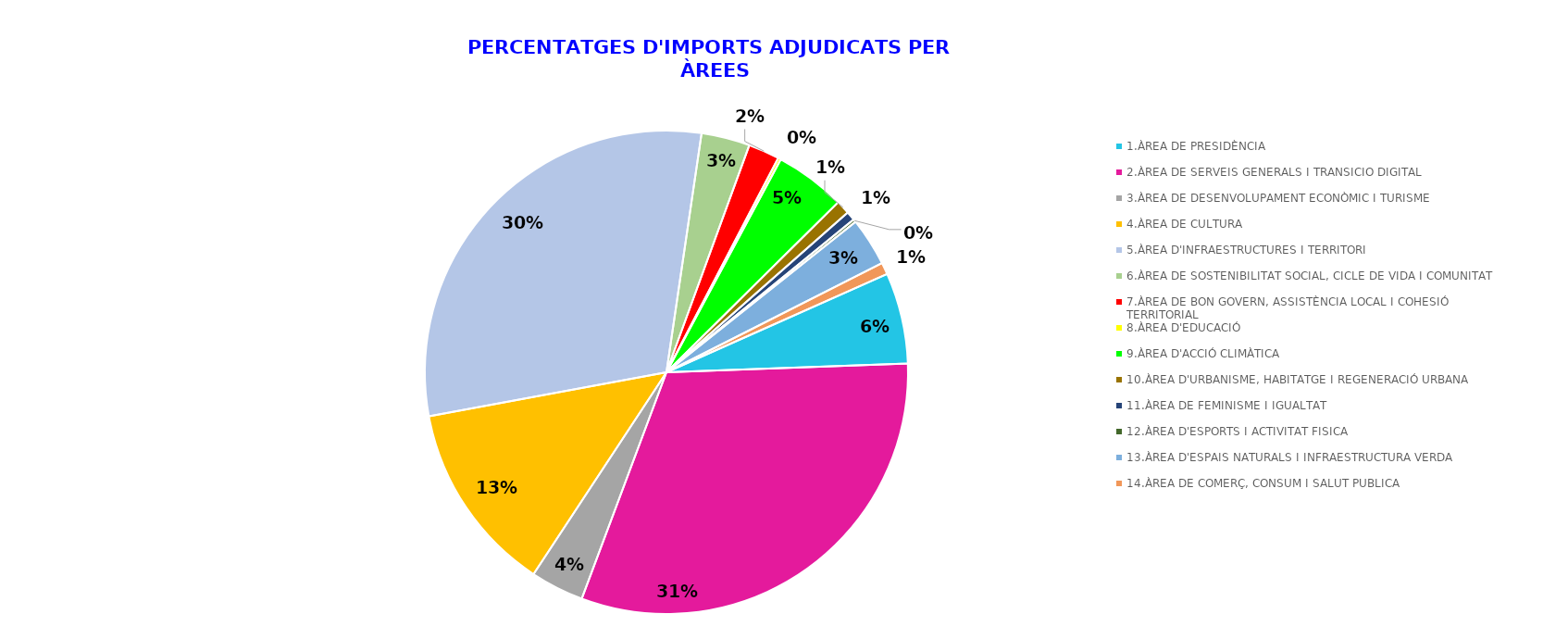
| Category | Series 0 |
|---|---|
| 1.ÀREA DE PRESIDÈNCIA | 0.061 |
| 2.ÀREA DE SERVEIS GENERALS I TRANSICIO DIGITAL | 0.313 |
| 3.ÀREA DE DESENVOLUPAMENT ECONÒMIC I TURISME  | 0.036 |
| 4.ÀREA DE CULTURA | 0.128 |
| 5.ÀREA D'INFRAESTRUCTURES I TERRITORI | 0.302 |
| 6.ÀREA DE SOSTENIBILITAT SOCIAL, CICLE DE VIDA I COMUNITAT | 0.032 |
| 7.ÀREA DE BON GOVERN, ASSISTÈNCIA LOCAL I COHESIÓ TERRITORIAL | 0.021 |
| 8.ÀREA D'EDUCACIÓ | 0.002 |
| 9.ÀREA D'ACCIÓ CLIMÀTICA | 0.047 |
| 10.ÀREA D'URBANISME, HABITATGE I REGENERACIÓ URBANA | 0.009 |
| 11.ÀREA DE FEMINISME I IGUALTAT | 0.006 |
| 12.ÀREA D'ESPORTS I ACTIVITAT FISICA | 0.002 |
| 13.ÀREA D'ESPAIS NATURALS I INFRAESTRUCTURA VERDA | 0.032 |
| 14.ÀREA DE COMERÇ, CONSUM I SALUT PUBLICA | 0.008 |